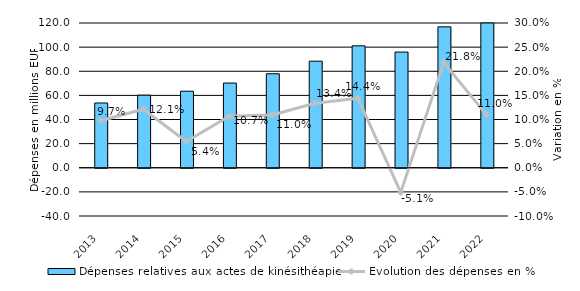
| Category | Dépenses relatives aux actes de kinésithéapie |
|---|---|
| 2013.0 | 53.669 |
| 2014.0 | 60.181 |
| 2015.0 | 63.457 |
| 2016.0 | 70.226 |
| 2017.0 | 77.919 |
| 2018.0 | 88.333 |
| 2019.0 | 101.058 |
| 2020.0 | 95.9 |
| 2021.0 | 116.814 |
| 2022.0 | 129.624 |